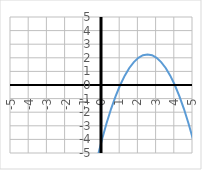
| Category | y |
|---|---|
| -5.0 | -54 |
| -4.75 | -50.312 |
| -4.5 | -46.75 |
| -4.25 | -43.312 |
| -4.0 | -40 |
| -3.75 | -36.812 |
| -3.5 | -33.75 |
| -3.25 | -30.812 |
| -3.0 | -28 |
| -2.75 | -25.312 |
| -2.5 | -22.75 |
| -2.25 | -20.312 |
| -2.0 | -18 |
| -1.75 | -15.812 |
| -1.5 | -13.75 |
| -1.25 | -11.812 |
| -1.0 | -10 |
| -0.75 | -8.312 |
| -0.5 | -6.75 |
| -0.25 | -5.312 |
| 0.0 | -4 |
| 0.25 | -2.812 |
| 0.5 | -1.75 |
| 0.75 | -0.812 |
| 1.0 | 0 |
| 1.25 | 0.688 |
| 1.5 | 1.25 |
| 1.75 | 1.688 |
| 2.0 | 2 |
| 2.25 | 2.188 |
| 2.5 | 2.25 |
| 2.75 | 2.188 |
| 3.0 | 2 |
| 3.25 | 1.688 |
| 3.5 | 1.25 |
| 3.75 | 0.688 |
| 4.0 | 0 |
| 4.25 | -0.812 |
| 4.5 | -1.75 |
| 4.75 | -2.812 |
| 5.0 | -4 |